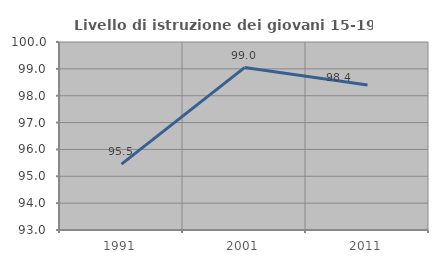
| Category | Livello di istruzione dei giovani 15-19 anni |
|---|---|
| 1991.0 | 95.455 |
| 2001.0 | 99.048 |
| 2011.0 | 98.4 |